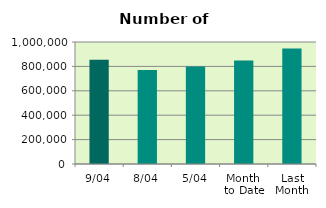
| Category | Series 0 |
|---|---|
| 9/04 | 855344 |
| 8/04 | 770068 |
| 5/04 | 799156 |
| Month 
to Date | 848558 |
| Last
Month | 947588.19 |